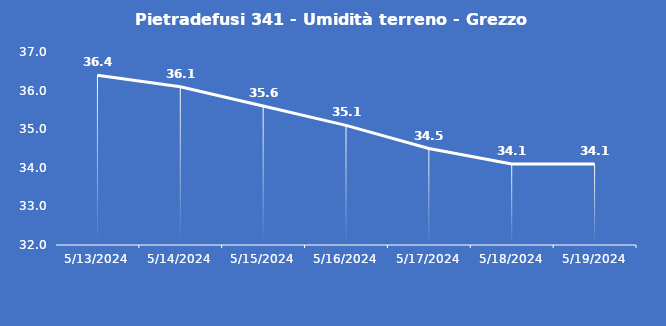
| Category | Pietradefusi 341 - Umidità terreno - Grezzo (%VWC) |
|---|---|
| 5/13/24 | 36.4 |
| 5/14/24 | 36.1 |
| 5/15/24 | 35.6 |
| 5/16/24 | 35.1 |
| 5/17/24 | 34.5 |
| 5/18/24 | 34.1 |
| 5/19/24 | 34.1 |